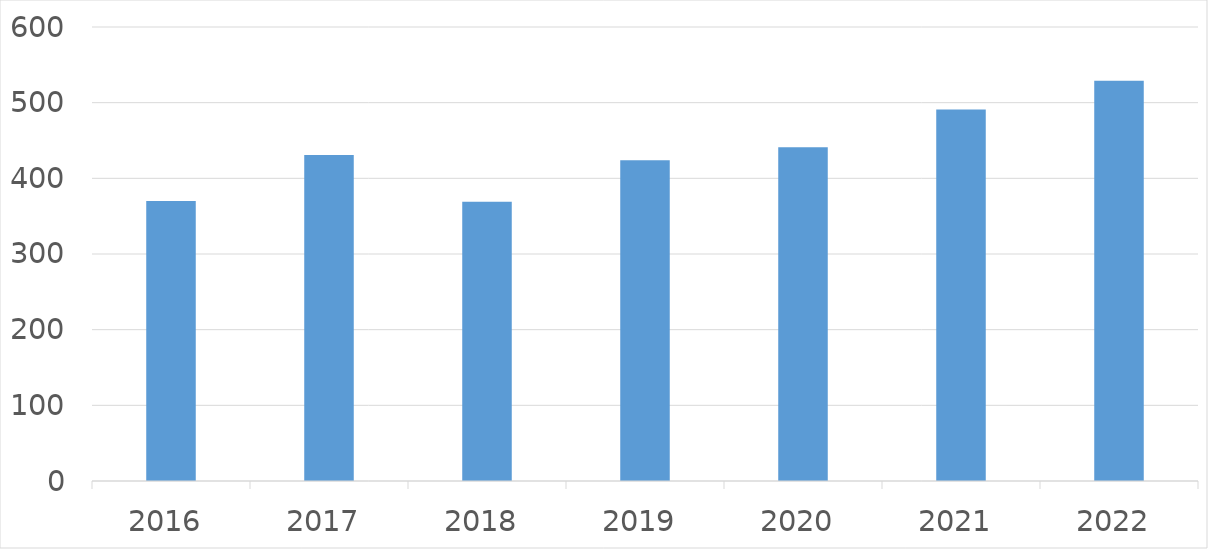
| Category | Series 0 |
|---|---|
| 2016 | 370 |
| 2017 | 431 |
| 2018 | 369 |
| 2019 | 424 |
| 2020 | 441 |
| 2021 | 491 |
| 2022 | 529 |